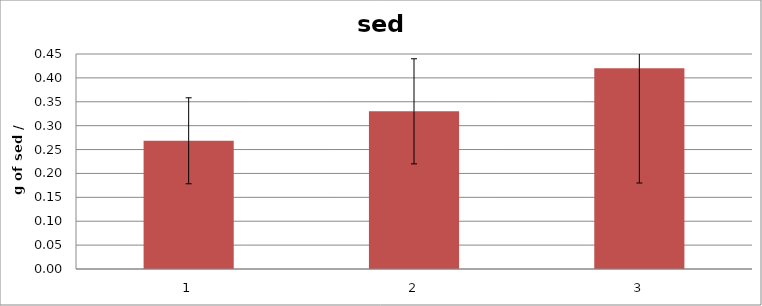
| Category | sed (g) |
|---|---|
| 0 | 0.268 |
| 1 | 0.33 |
| 2 | 0.42 |